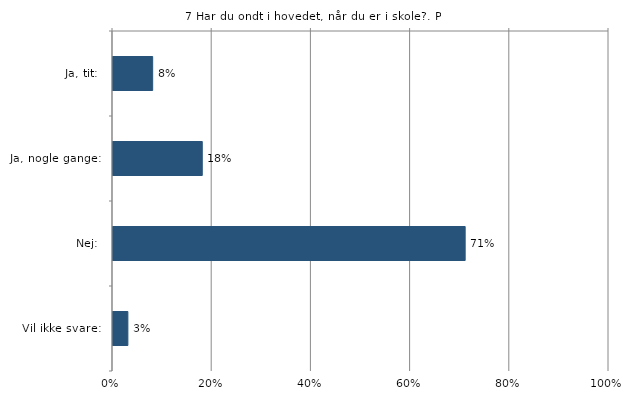
| Category | Har du ondt i hovedet, når du er i skole? |
|---|---|
| Ja, tit:  | 0.08 |
| Ja, nogle gange:  | 0.18 |
| Nej:  | 0.71 |
| Vil ikke svare:  | 0.03 |